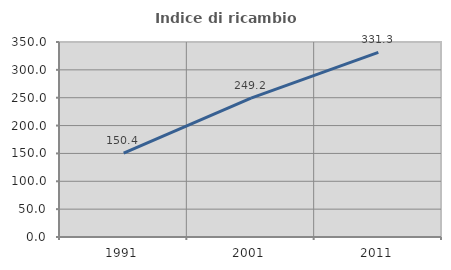
| Category | Indice di ricambio occupazionale  |
|---|---|
| 1991.0 | 150.448 |
| 2001.0 | 249.153 |
| 2011.0 | 331.336 |